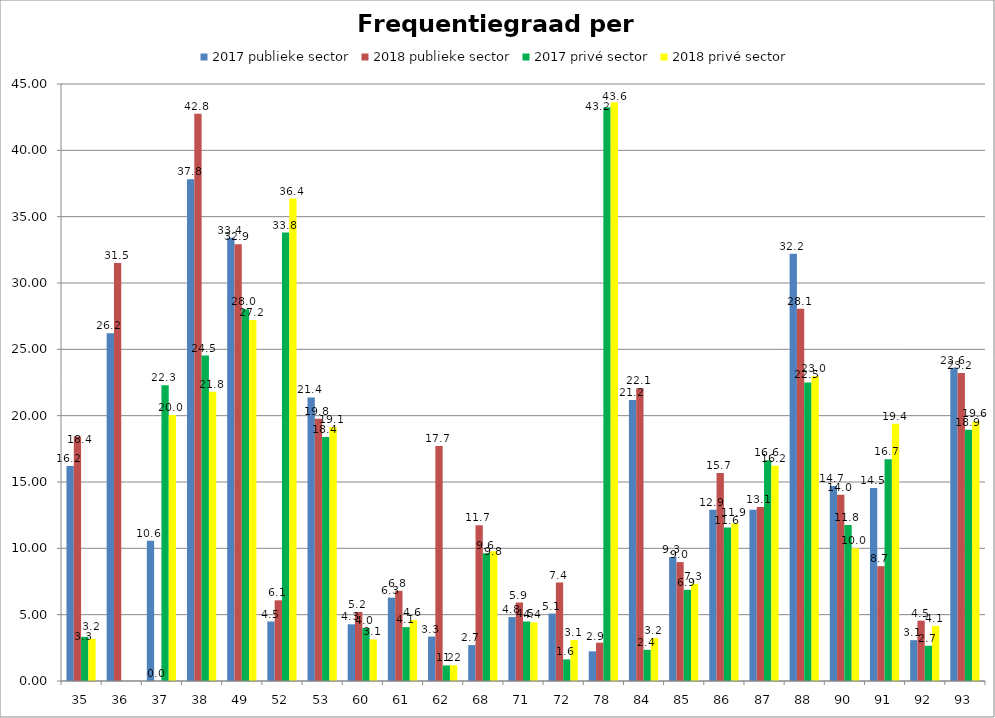
| Category | 2017 publieke sector | 2018 publieke sector | 2017 privé sector | 2018 privé sector |
|---|---|---|---|---|
| 35 | 16.197 | 18.432 | 3.324 | 3.174 |
| 36 | 26.203 | 31.505 | 0 | 0 |
| 37 | 10.573 | 0 | 22.29 | 20.05 |
| 38 | 37.816 | 42.752 | 24.535 | 21.796 |
| 49 | 33.407 | 32.916 | 28.027 | 27.205 |
| 52 | 4.483 | 6.08 | 33.804 | 36.364 |
| 53 | 21.375 | 19.765 | 18.392 | 19.148 |
| 60 | 4.272 | 5.205 | 3.999 | 3.135 |
| 61 | 6.284 | 6.798 | 4.063 | 4.597 |
| 62 | 3.349 | 17.709 | 1.172 | 1.184 |
| 68 | 2.705 | 11.738 | 9.635 | 9.787 |
| 71 | 4.819 | 5.916 | 4.485 | 4.415 |
| 72 | 5.083 | 7.42 | 1.628 | 3.089 |
| 78 | 2.235 | 2.885 | 43.248 | 43.627 |
| 84 | 21.172 | 22.057 | 2.353 | 3.247 |
| 85 | 9.341 | 8.961 | 6.872 | 7.327 |
| 86 | 12.899 | 15.673 | 11.565 | 11.867 |
| 87 | 12.909 | 13.114 | 16.646 | 16.216 |
| 88 | 32.199 | 28.062 | 22.505 | 22.975 |
| 90 | 14.691 | 14.035 | 11.758 | 10.008 |
| 91 | 14.549 | 8.656 | 16.713 | 19.395 |
| 92 | 3.078 | 4.548 | 2.657 | 4.142 |
| 93 | 23.603 | 23.209 | 18.936 | 19.562 |